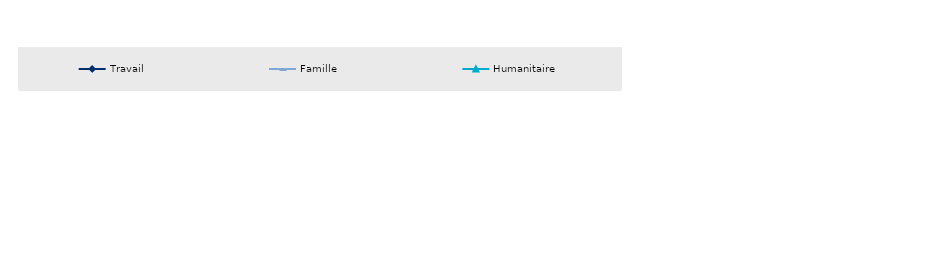
| Category | Travail | Famille | Humanitaire |
|---|---|---|---|
| <5 ans | 0.859 | 0.519 | 0.502 |
| 5-9 ans | 0.84 | 0.59 | 0.598 |
| >10 ans | 0.791 | 0.722 | 0.713 |